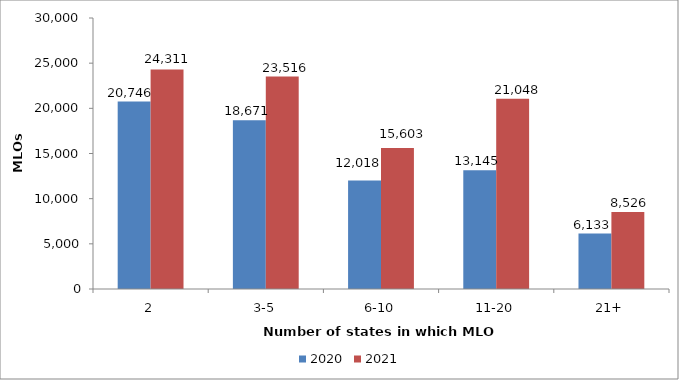
| Category | 2020 | 2021 |
|---|---|---|
| 2 | 20746 | 24311 |
| 3-5 | 18671 | 23516 |
| 6-10 | 12018 | 15603 |
| 11-20 | 13145 | 21048 |
| 21+ | 6133 | 8526 |